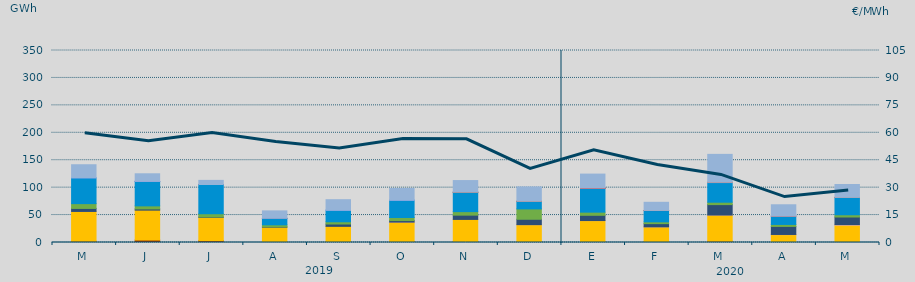
| Category | Carbón | Ciclo Combinado | Cogeneración | Consumo Bombeo | Eólica | Hidráulica | Nuclear | Otras Renovables | Solar fotovoltaica | Solar térmica | Turbinación bombeo |
|---|---|---|---|---|---|---|---|---|---|---|---|
| M | 2251.7 | 54358.5 | 20 | 5480.5 | 8758.9 | 47108.2 | 0 | 17.2 | 0 | 0 | 23767.4 |
| J | 4465.4 | 54530.5 | 0 | 2188.8 | 5586 | 44612.2 | 174.7 | 1.4 | 0 | 0 | 13701.1 |
| J | 3289.6 | 42570.7 | 0 | 636.6 | 5909.9 | 53272.1 | 42.5 | 0 | 0 | 0 | 7519.8 |
| A | 446.5 | 27502.9 | 0 | 624.2 | 3670.3 | 11750 | 1 | 0 | 0 | 0 | 13635.5 |
| S | 460.6 | 28967.7 | 0 | 4234.7 | 4105.5 | 21199.2 | 0 | 2.6 | 0 | 0 | 19063.6 |
| O | 1718.2 | 35506.1 | 18 | 2744.7 | 5556.7 | 31702.3 | 0 | 0.8 | 0 | 0 | 21165.2 |
| N | 1857.3 | 40203.9 | 0 | 7774.6 | 6415.7 | 35320.4 | 90 | 0 | 4.8 | 0 | 21237.9 |
| D | 554 | 31978.8 | 44.6 | 9751.3 | 18898.5 | 13540.8 | 366.6 | 0 | 2.1 | 0 | 26259.7 |
| E | 1376.4 | 38547.2 | 103.6 | 9542.6 | 5736.2 | 43797.8 | 0.3 | 0 | 1.3 | 1 | 25589.5 |
| F | 1350.5 | 27202.4 | 33.6 | 5812.5 | 3281.1 | 20532.5 | 140 | 103.7 | 7.4 | 0 | 14830 |
| M | 2245.9 | 47824.7 | 73.5 | 18946.1 | 4359.7 | 35788.8 | 0 | 674.6 | 8.2 | 0 | 50742.6 |
| A | 0 | 14386.3 | 255.3 | 14671.4 | 3599.9 | 14970.4 | 0 | 474.6 | 1.7 | 0 | 20437.2 |
| M | 0 | 31710.8 | 991.1 | 13782.9 | 4057.5 | 31461.1 | 16.4 | 257 | 5.9 | 0 | 23468.1 |